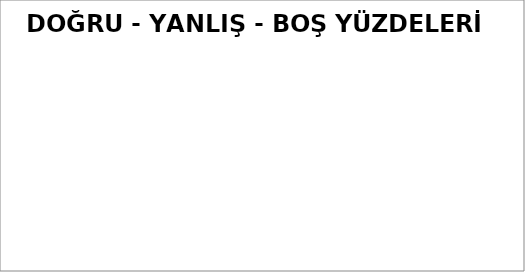
| Category | DOĞRU YANLIŞ BOŞ |
|---|---|
| DOĞRU | 0 |
| YANLIŞ | 0 |
| BOŞ | 0 |